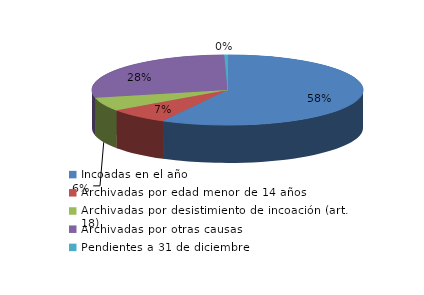
| Category | Series 0 |
|---|---|
| Incoadas en el año | 2705 |
| Archivadas por edad menor de 14 años | 344 |
| Archivadas por desistimiento de incoación (art. 18) | 291 |
| Archivadas por otras causas | 1317 |
| Pendientes a 31 de diciembre | 18 |